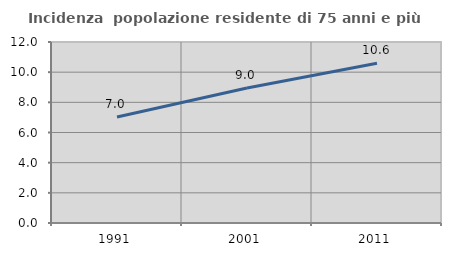
| Category | Incidenza  popolazione residente di 75 anni e più |
|---|---|
| 1991.0 | 7.028 |
| 2001.0 | 8.951 |
| 2011.0 | 10.586 |